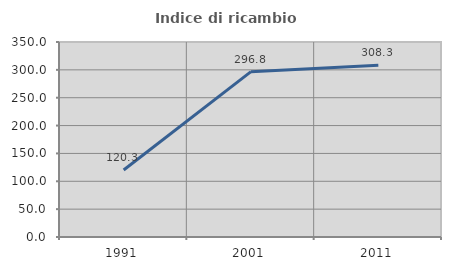
| Category | Indice di ricambio occupazionale  |
|---|---|
| 1991.0 | 120.29 |
| 2001.0 | 296.774 |
| 2011.0 | 308.333 |